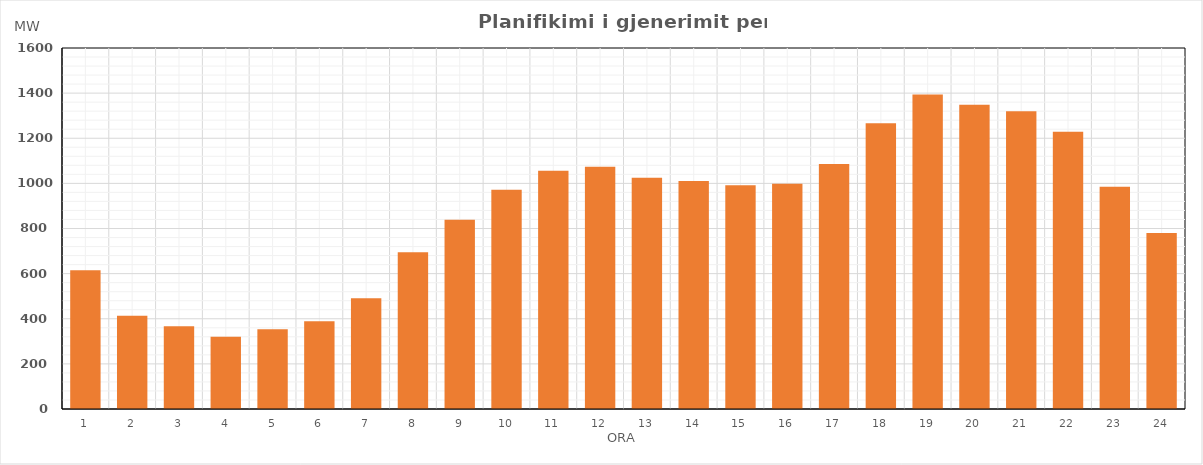
| Category | Max (MW) |
|---|---|
| 0 | 615.1 |
| 1 | 413.6 |
| 2 | 367.27 |
| 3 | 320.28 |
| 4 | 353.38 |
| 5 | 388.5 |
| 6 | 490.92 |
| 7 | 695.1 |
| 8 | 839.05 |
| 9 | 971.38 |
| 10 | 1056.28 |
| 11 | 1073.47 |
| 12 | 1025.27 |
| 13 | 1010.15 |
| 14 | 992.05 |
| 15 | 998.21 |
| 16 | 1086.41 |
| 17 | 1266.6 |
| 18 | 1394 |
| 19 | 1348.32 |
| 20 | 1319.23 |
| 21 | 1229.25 |
| 22 | 984.56 |
| 23 | 780.36 |